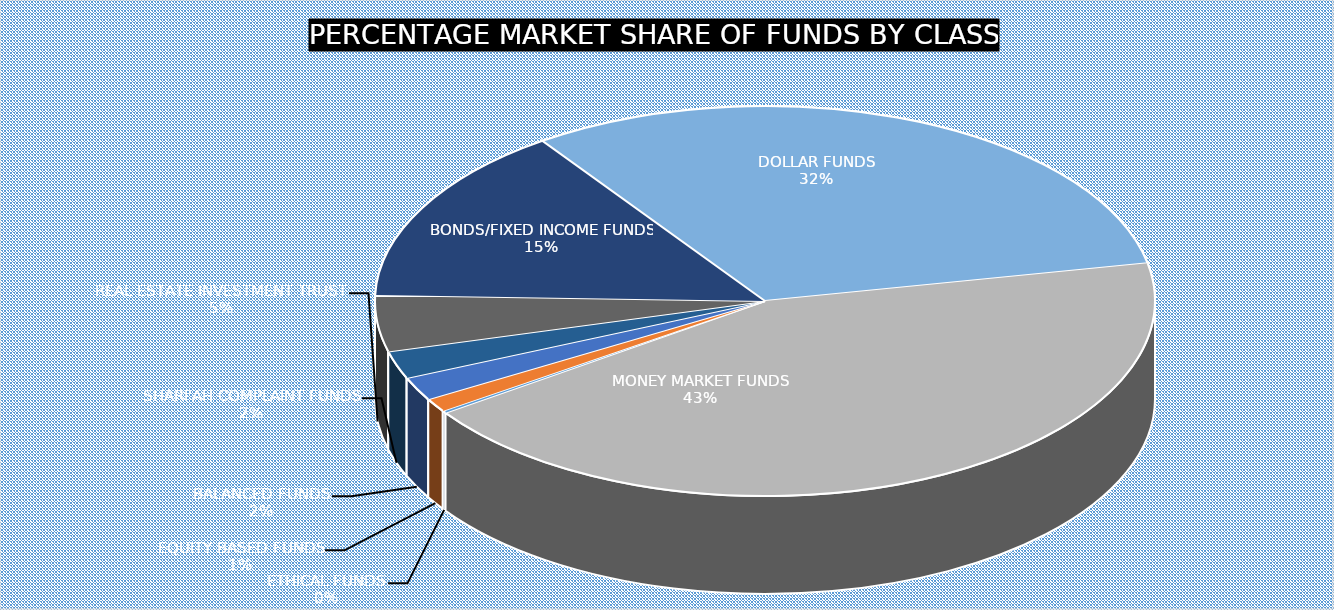
| Category | 20-Oct |
|---|---|
| ETHICAL FUNDS | 3851756766.68 |
| EQUITY BASED FUNDS | 22321023691.511 |
| BALANCED FUNDS | 39125729977.492 |
| SHARI'AH COMPLAINT FUNDS | 45993634878.97 |
| REAL ESTATE INVESTMENT TRUST | 93071505879.83 |
| BONDS/FIXED INCOME FUNDS | 297314764640.835 |
| DOLLAR FUNDS | 631778541802.777 |
| MONEY MARKET FUNDS | 868733209665.15 |